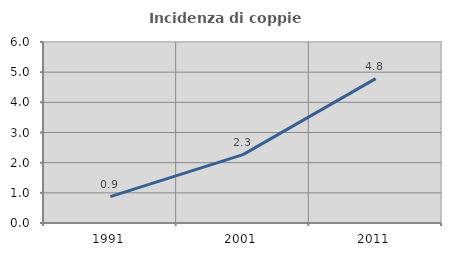
| Category | Incidenza di coppie miste |
|---|---|
| 1991.0 | 0.873 |
| 2001.0 | 2.267 |
| 2011.0 | 4.787 |